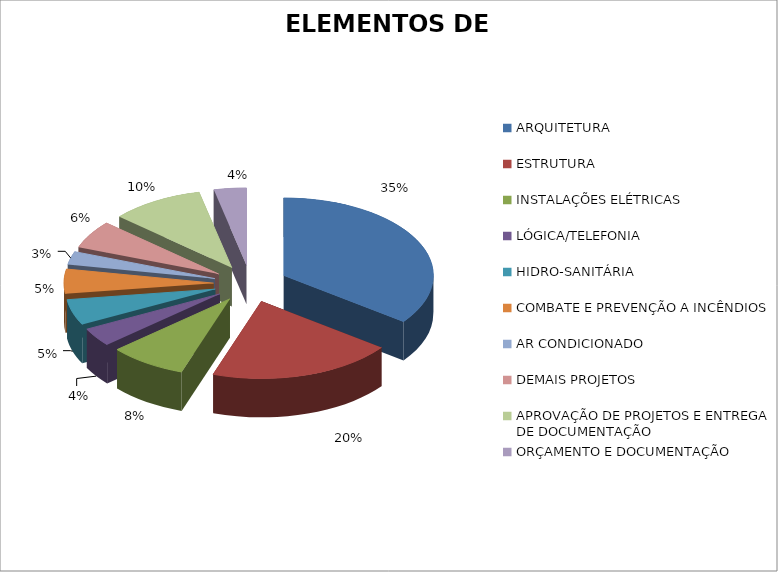
| Category | Series 0 |
|---|---|
| ARQUITETURA | 0.352 |
| ESTRUTURA | 0.2 |
| INSTALAÇÕES ELÉTRICAS | 0.084 |
| LÓGICA/TELEFONIA | 0.039 |
| HIDRO-SANITÁRIA | 0.054 |
| COMBATE E PREVENÇÃO A INCÊNDIOS | 0.051 |
| AR CONDICIONADO | 0.028 |
| DEMAIS PROJETOS | 0.058 |
| APROVAÇÃO DE PROJETOS E ENTREGA DE DOCUMENTAÇÃO | 0.1 |
| ORÇAMENTO E DOCUMENTAÇÃO | 0.035 |